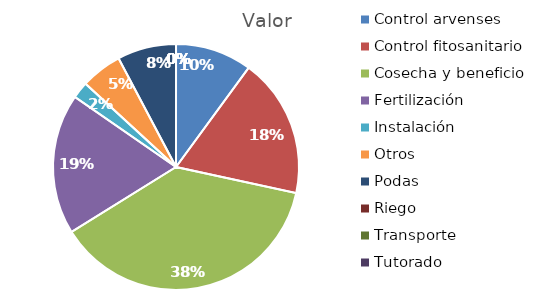
| Category | Valor |
|---|---|
| Control arvenses | 6806410 |
| Control fitosanitario | 12408609 |
| Cosecha y beneficio | 25531892 |
| Fertilización | 12513323 |
| Instalación | 1488433 |
| Otros | 3664990 |
| Podas | 5235700 |
| Riego | 0 |
| Transporte | 0 |
| Tutorado | 0 |